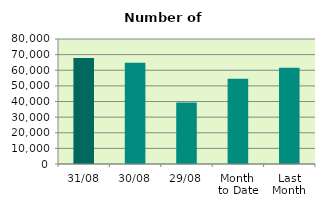
| Category | Series 0 |
|---|---|
| 31/08 | 67812 |
| 30/08 | 64726 |
| 29/08 | 39354 |
| Month 
to Date | 54581.565 |
| Last
Month | 61549.619 |